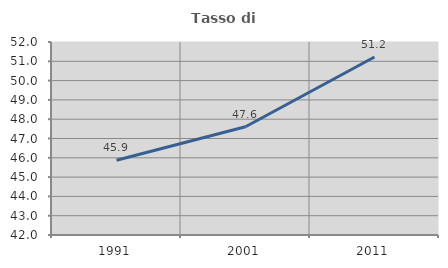
| Category | Tasso di occupazione   |
|---|---|
| 1991.0 | 45.873 |
| 2001.0 | 47.608 |
| 2011.0 | 51.222 |